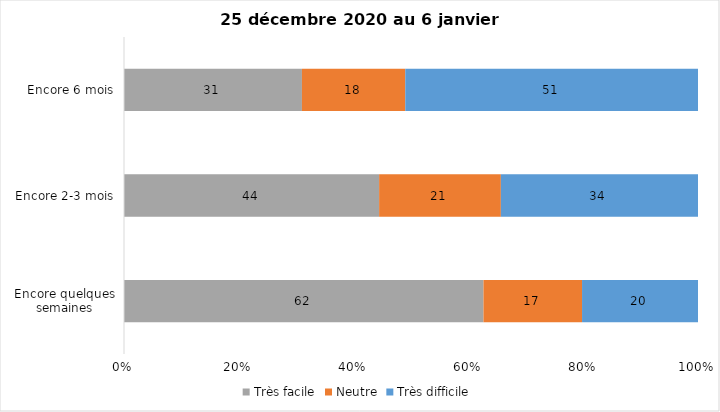
| Category | Très facile | Neutre | Très difficile |
|---|---|---|---|
| Encore quelques semaines | 62 | 17 | 20 |
| Encore 2-3 mois | 44 | 21 | 34 |
| Encore 6 mois | 31 | 18 | 51 |